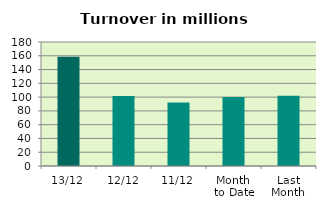
| Category | Series 0 |
|---|---|
| 13/12 | 158.435 |
| 12/12 | 101.506 |
| 11/12 | 92.181 |
| Month 
to Date | 100.122 |
| Last
Month | 101.866 |